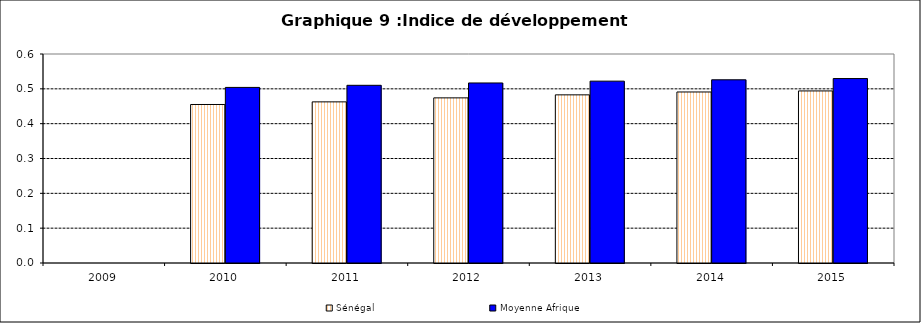
| Category | Sénégal | Moyenne Afrique |
|---|---|---|
| 2009.0 | 0 | 0 |
| 2010.0 | 0.455 | 0.504 |
| 2011.0 | 0.463 | 0.51 |
| 2012.0 | 0.474 | 0.517 |
| 2013.0 | 0.483 | 0.522 |
| 2014.0 | 0.491 | 0.526 |
| 2015.0 | 0.494 | 0.53 |